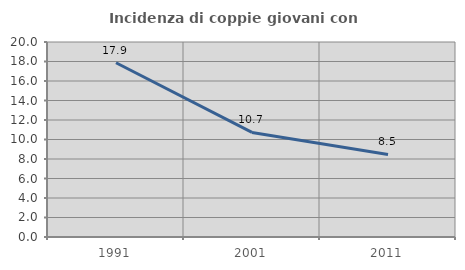
| Category | Incidenza di coppie giovani con figli |
|---|---|
| 1991.0 | 17.87 |
| 2001.0 | 10.727 |
| 2011.0 | 8.466 |